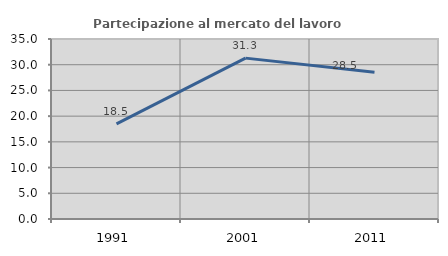
| Category | Partecipazione al mercato del lavoro  femminile |
|---|---|
| 1991.0 | 18.51 |
| 2001.0 | 31.282 |
| 2011.0 | 28.534 |